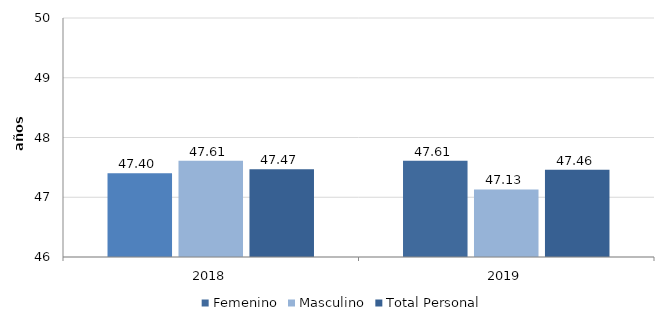
| Category | Femenino | Masculino | Total Personal |
|---|---|---|---|
| 2018.0 | 47.4 | 47.61 | 47.47 |
| 2019.0 | 47.61 | 47.13 | 47.46 |